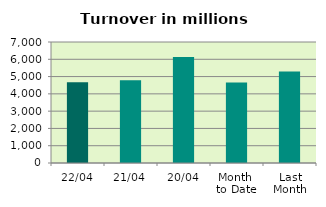
| Category | Series 0 |
|---|---|
| 22/04 | 4667.714 |
| 21/04 | 4784.064 |
| 20/04 | 6127.701 |
| Month 
to Date | 4660.359 |
| Last
Month | 5289.077 |